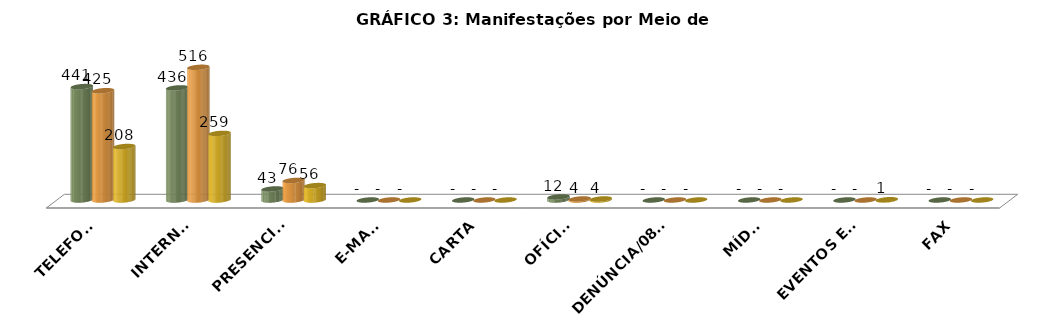
| Category | ABRIL | MAIO | JUNHO |
|---|---|---|---|
| TELEFONE | 441 | 425 | 208 |
| INTERNET | 436 | 516 | 259 |
| PRESENCIAL | 43 | 76 | 56 |
| E-MAIL | 0 | 0 | 0 |
| CARTA | 0 | 0 | 0 |
| OFÍCIO | 12 | 4 | 4 |
| DENÚNCIA/0800 | 0 | 0 | 0 |
| MÍDIA | 0 | 0 | 0 |
| EVENTOS EXT | 0 | 0 | 1 |
| FAX | 0 | 0 | 0 |